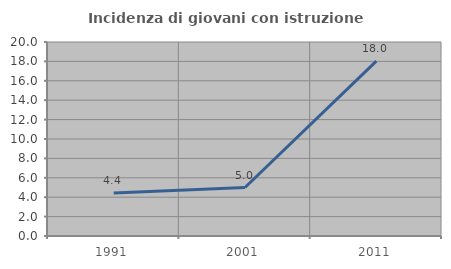
| Category | Incidenza di giovani con istruzione universitaria |
|---|---|
| 1991.0 | 4.444 |
| 2001.0 | 5 |
| 2011.0 | 18.033 |